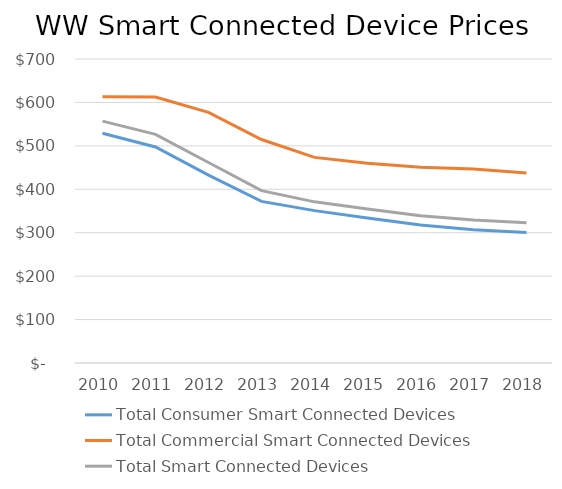
| Category | Total Consumer Smart Connected Devices | Total Commercial Smart Connected Devices | Total Smart Connected Devices |
|---|---|---|---|
| 2010.0 | 529.09 | 612.99 | 556.91 |
| 2011.0 | 497.5 | 612.36 | 526.49 |
| 2012.0 | 432.59 | 577.22 | 461.62 |
| 2013.0 | 372.16 | 514.57 | 396.82 |
| 2014.0 | 350.88 | 473.48 | 371.06 |
| 2015.0 | 334.12 | 459.9 | 354.44 |
| 2016.0 | 317.6 | 450.81 | 339.12 |
| 2017.0 | 306.99 | 446.51 | 329.51 |
| 2018.0 | 300.41 | 437.6 | 322.96 |